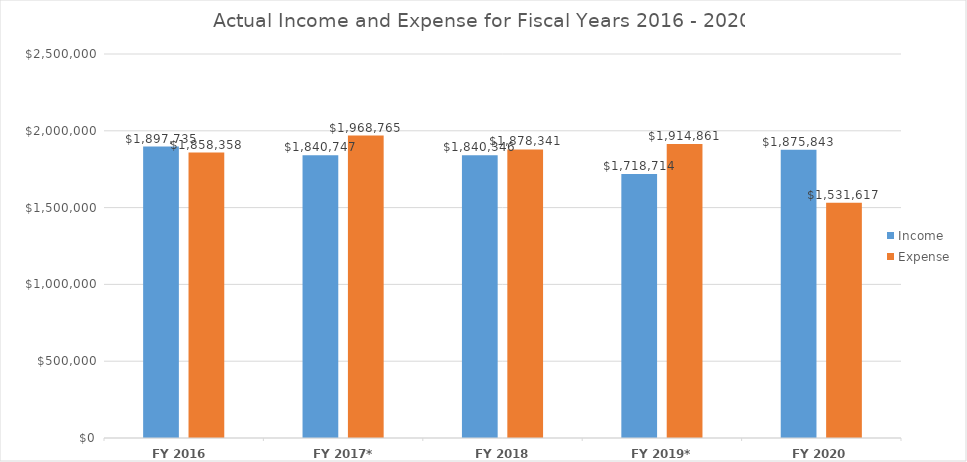
| Category | Income | Expense |
|---|---|---|
| FY 2016  | 1897735 | 1858358 |
| FY 2017* | 1840747 | 1968765 |
| FY 2018 * | 1840346 | 1878341 |
| FY 2019* | 1718714 | 1914861 |
| FY 2020 | 1875843 | 1531617 |